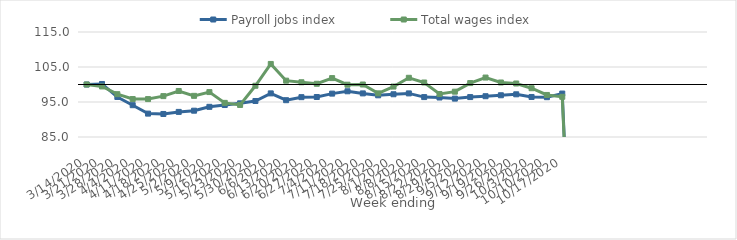
| Category | Payroll jobs index | Total wages index |
|---|---|---|
| 14/03/2020 | 100 | 100 |
| 21/03/2020 | 100.151 | 99.443 |
| 28/03/2020 | 96.434 | 97.235 |
| 04/04/2020 | 94.086 | 95.843 |
| 11/04/2020 | 91.68 | 95.831 |
| 18/04/2020 | 91.579 | 96.68 |
| 25/04/2020 | 92.171 | 98.145 |
| 02/05/2020 | 92.517 | 96.756 |
| 09/05/2020 | 93.62 | 97.838 |
| 16/05/2020 | 94.138 | 94.754 |
| 23/05/2020 | 94.623 | 94.156 |
| 30/05/2020 | 95.29 | 99.641 |
| 06/06/2020 | 97.462 | 105.871 |
| 13/06/2020 | 95.514 | 101.101 |
| 20/06/2020 | 96.382 | 100.64 |
| 27/06/2020 | 96.427 | 100.21 |
| 04/07/2020 | 97.393 | 101.827 |
| 11/07/2020 | 98.064 | 99.945 |
| 18/07/2020 | 97.458 | 99.997 |
| 25/07/2020 | 96.914 | 97.472 |
| 01/08/2020 | 97.212 | 99.413 |
| 08/08/2020 | 97.456 | 101.916 |
| 15/08/2020 | 96.404 | 100.568 |
| 22/08/2020 | 96.281 | 97.288 |
| 29/08/2020 | 95.967 | 97.954 |
| 05/09/2020 | 96.407 | 100.405 |
| 12/09/2020 | 96.654 | 101.985 |
| 19/09/2020 | 96.928 | 100.574 |
| 26/09/2020 | 97.2 | 100.289 |
| 03/10/2020 | 96.434 | 98.935 |
| 10/10/2020 | 96.376 | 97.01 |
| 17/10/2020 | 97.414 | 96.489 |